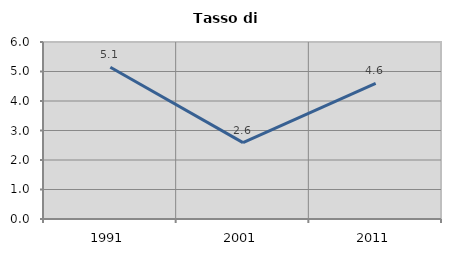
| Category | Tasso di disoccupazione   |
|---|---|
| 1991.0 | 5.146 |
| 2001.0 | 2.589 |
| 2011.0 | 4.596 |